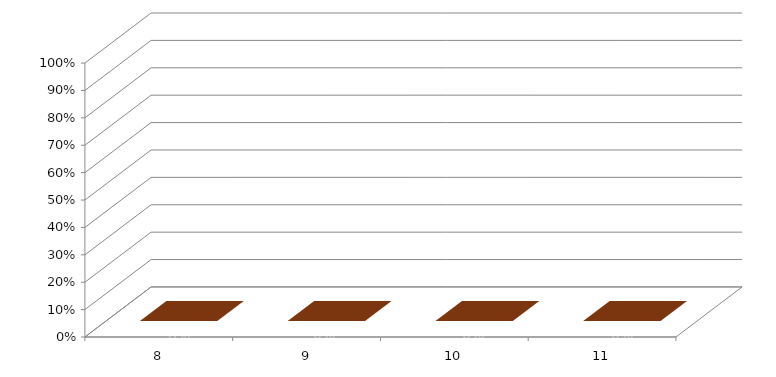
| Category | Series 3 |
|---|---|
| 8.0 | 0 |
| 9.0 | 0 |
| 10.0 | 0 |
| 11.0 | 0 |